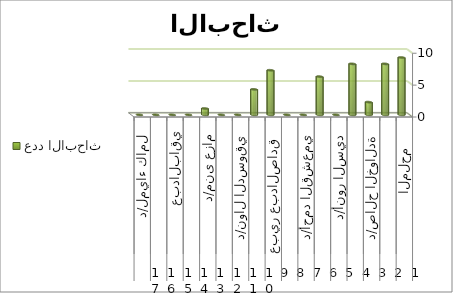
| Category | عدد الابحاث |
|---|---|
| 0 | 9 |
| 1 | 8 |
| 2 | 2 |
| 3 | 8 |
| 4 | 0 |
| 5 | 6 |
| 6 | 0 |
| 7 | 0 |
| 8 | 7 |
| 9 | 4 |
| 10 | 0 |
| 11 | 0 |
| 12 | 1 |
| 13 | 0 |
| 14 | 0 |
| 15 | 0 |
| 16 | 0 |